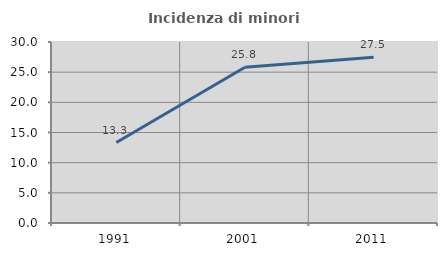
| Category | Incidenza di minori stranieri |
|---|---|
| 1991.0 | 13.333 |
| 2001.0 | 25.806 |
| 2011.0 | 27.457 |